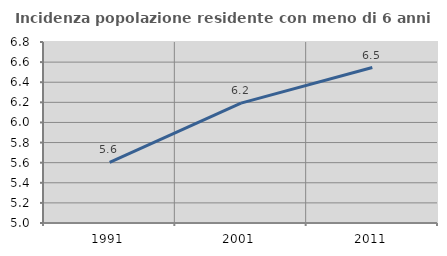
| Category | Incidenza popolazione residente con meno di 6 anni |
|---|---|
| 1991.0 | 5.602 |
| 2001.0 | 6.192 |
| 2011.0 | 6.546 |